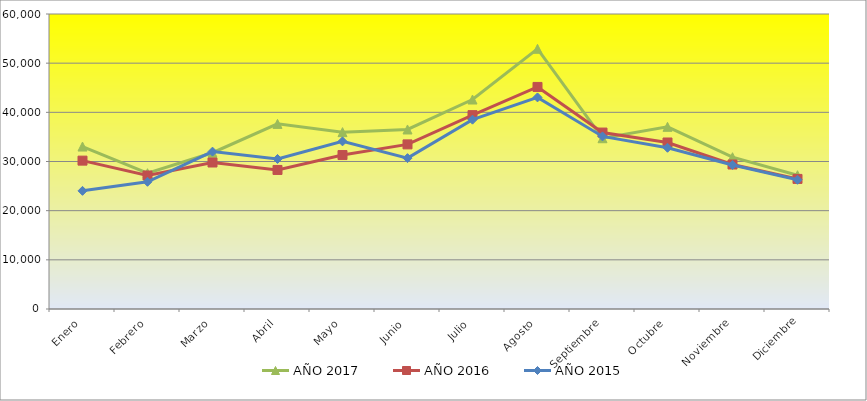
| Category | AÑO 2017 | AÑO 2016 | AÑO 2015 |
|---|---|---|---|
| Enero | 33040.435 | 30176 | 24029 |
| Febrero | 27621.469 | 27150 | 25871 |
| Marzo | 31785.683 | 29795 | 32007 |
| Abril | 37651.817 | 28280 | 30514 |
| Mayo | 35974.172 | 31311 | 34097 |
| Junio | 36511.751 | 33481 | 30685 |
| Julio | 42604.052 | 39426 | 38506 |
| Agosto | 52919.985 | 45168 | 43038 |
| Septiembre | 34733.025 | 35886 | 35102 |
| Octubre | 37052.082 | 33866 | 32794 |
| Noviembre | 30876.807 | 29390 | 29295 |
| Diciembre | 27214.227 | 26458 | 26282 |